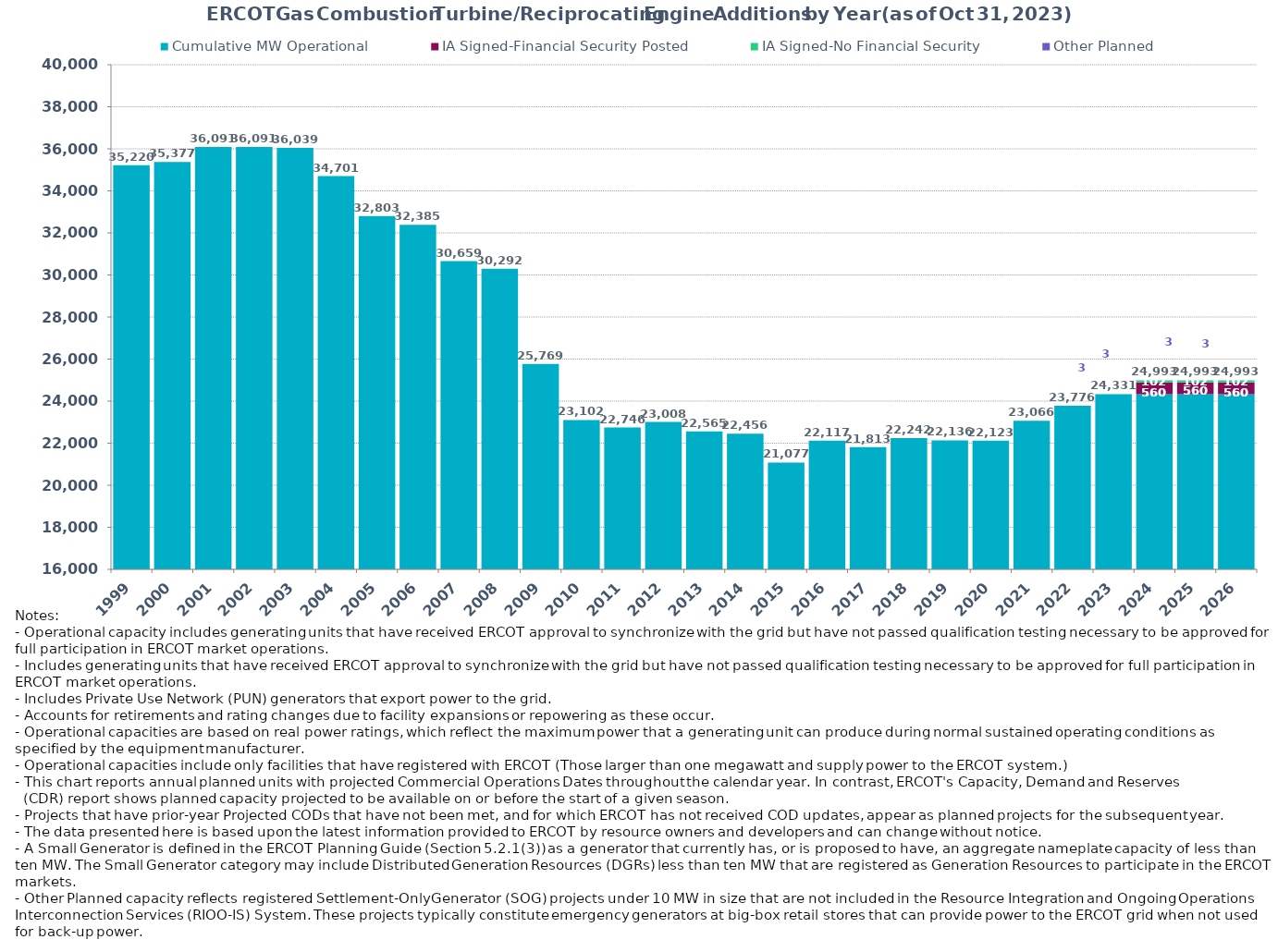
| Category | Cumulative MW Operational | IA Signed-Financial Security Posted | IA Signed-No Financial Security  | Other Planned | Cumulative Installed and Planned |
|---|---|---|---|---|---|
| 1999.0 | 35219.87 | 0 | 0 | 0 | 35219.87 |
| 2000.0 | 35377.48 | 0 | 0 | 0 | 35377.48 |
| 2001.0 | 36091.14 | 0 | 0 | 0 | 36091.14 |
| 2002.0 | 36091.14 | 0 | 0 | 0 | 36091.14 |
| 2003.0 | 36039.14 | 0 | 0 | 0 | 36039.14 |
| 2004.0 | 34701.24 | 0 | 0 | 0 | 34701.24 |
| 2005.0 | 32803.04 | 0 | 0 | 0 | 32803.04 |
| 2006.0 | 32385.14 | 0 | 0 | 0 | 32385.14 |
| 2007.0 | 30659.14 | 0 | 0 | 0 | 30659.14 |
| 2008.0 | 30291.94 | 0 | 0 | 0 | 30291.94 |
| 2009.0 | 25769.37 | 0 | 0 | 0 | 25769.37 |
| 2010.0 | 23102.25 | 0 | 0 | 0 | 23102.25 |
| 2011.0 | 22745.55 | 0 | 0 | 0 | 22745.55 |
| 2012.0 | 23007.75 | 0 | 0 | 0 | 23007.75 |
| 2013.0 | 22564.91 | 0 | 0 | 0 | 22564.91 |
| 2014.0 | 22455.91 | 0 | 0 | 0 | 22455.91 |
| 2015.0 | 21077.11 | 0 | 0 | 0 | 21077.11 |
| 2016.0 | 22117.49 | 0 | 0 | 0 | 22117.49 |
| 2017.0 | 21812.63 | 0 | 0 | 0 | 21812.63 |
| 2018.0 | 22241.79 | 0 | 0 | 0 | 22241.79 |
| 2019.0 | 22136.49 | 0 | 0 | 0 | 22136.49 |
| 2020.0 | 22123.49 | 0 | 0 | 0 | 22123.49 |
| 2021.0 | 23065.69 | 0 | 0 | 0 | 23065.69 |
| 2022.0 | 23775.84 | 0 | 0 | 0 | 23775.84 |
| 2023.0 | 24328.24 | 0 | 0 | 2.8 | 24331.04 |
| 2024.0 | 24328.24 | 560 | 102 | 2.8 | 24993.04 |
| 2025.0 | 24328.24 | 560 | 102 | 2.8 | 24993.04 |
| 2026.0 | 24328.24 | 560 | 102 | 2.8 | 24993.04 |